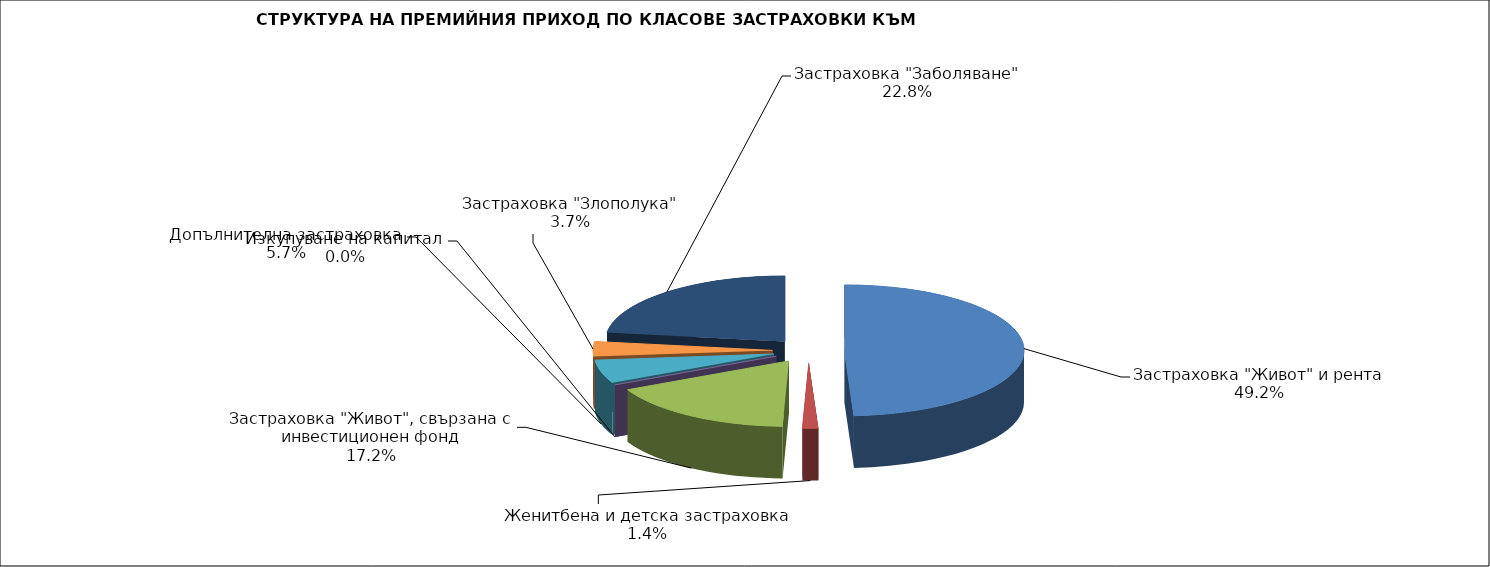
| Category | Series 0 |
|---|---|
| Застраховка "Живот" и рента | 108464536.033 |
| Женитбена и детска застраховка | 3117557.448 |
| Застраховка "Живот", свързана с инвестиционен фонд | 37910557.772 |
| Изкупуване на капитал | 0 |
| Допълнителна застраховка | 12686026.643 |
| Застраховка "Злополука" | 8116332.5 |
| Застраховка "Заболяване" | 50369469.1 |